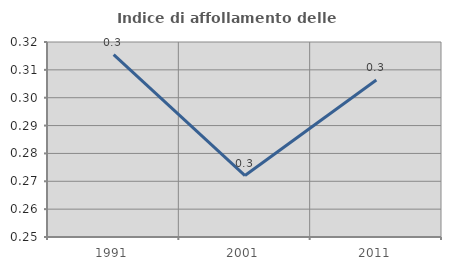
| Category | Indice di affollamento delle abitazioni  |
|---|---|
| 1991.0 | 0.315 |
| 2001.0 | 0.272 |
| 2011.0 | 0.306 |